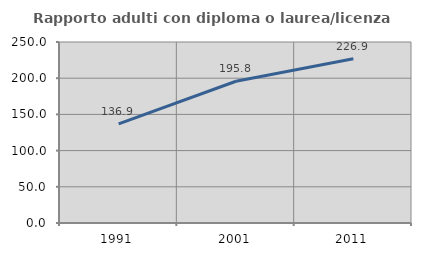
| Category | Rapporto adulti con diploma o laurea/licenza media  |
|---|---|
| 1991.0 | 136.905 |
| 2001.0 | 195.755 |
| 2011.0 | 226.923 |